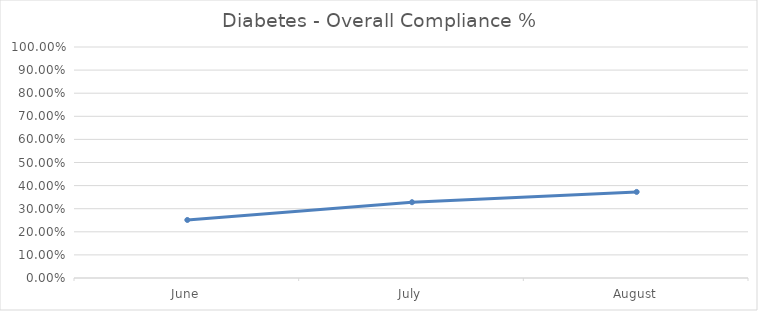
| Category | Diabetes - Overall Compliance % |
|---|---|
| June | 0.251 |
| July | 0.328 |
| August | 0.373 |